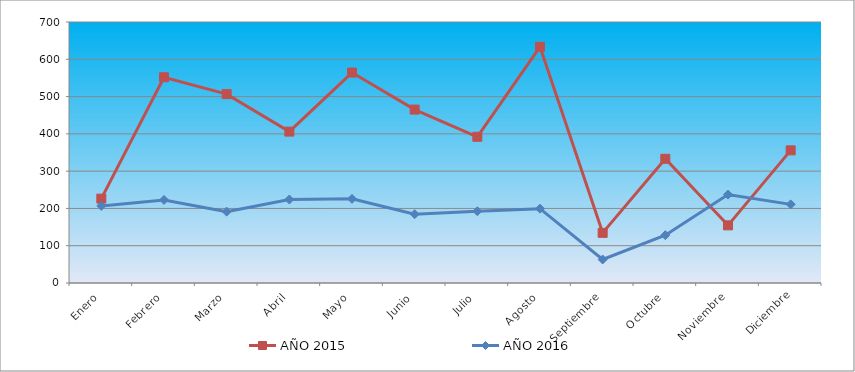
| Category | AÑO 2015 | AÑO 2016 |
|---|---|---|
| Enero | 226.262 | 206.795 |
| Febrero | 551.827 | 222.702 |
| Marzo | 506.575 | 191.369 |
| Abril | 406.014 | 223.926 |
| Mayo | 564.397 | 225.747 |
| Junio | 465.093 | 184.493 |
| Julio | 392.187 | 192.515 |
| Agosto | 633.532 | 199.39 |
| Septiembre | 134.5 | 63.026 |
| Octubre | 333.107 | 128.343 |
| Noviembre | 154.612 | 237.206 |
| Diciembre | 355.733 | 210.85 |